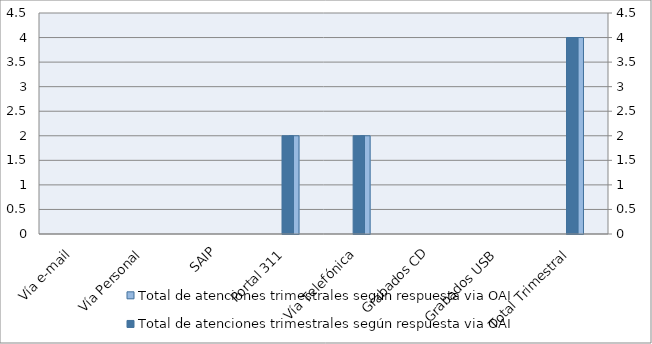
| Category | Total de atenciones trimestrales según respuesta via OAI | Series 2 | Series 4 |
|---|---|---|---|
| Vía e-mail | 0 |  |  |
| Vía Personal | 0 |  |  |
| SAIP | 0 |  |  |
| Portal 311 | 2 |  |  |
| Vía Telefónica | 2 |  |  |
| Grabados CD | 0 |  |  |
| Grabados USB | 0 |  |  |
| Total Trimestral | 4 |  |  |